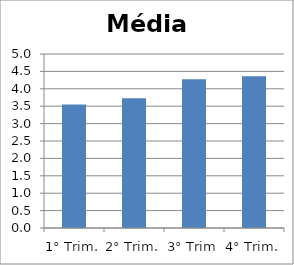
| Category | Média: |
|---|---|
| 1° Trim. | 3.545 |
| 2° Trim. | 3.727 |
| 3° Trim | 4.273 |
| 4° Trim. | 4.364 |